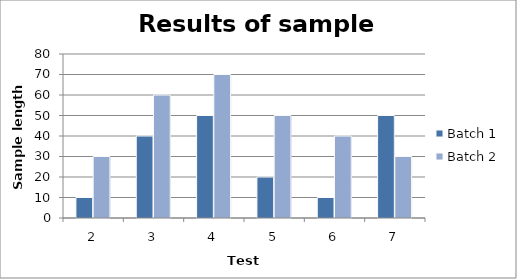
| Category | Batch 1 | Batch 2 |
|---|---|---|
| 2.0 | 10 | 30 |
| 3.0 | 40 | 60 |
| 4.0 | 50 | 70 |
| 5.0 | 20 | 50 |
| 6.0 | 10 | 40 |
| 7.0 | 50 | 30 |